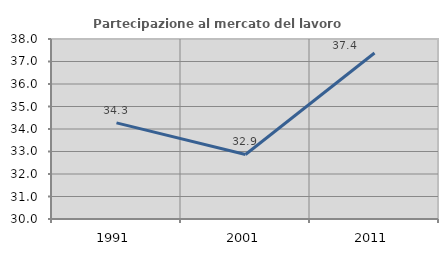
| Category | Partecipazione al mercato del lavoro  femminile |
|---|---|
| 1991.0 | 34.273 |
| 2001.0 | 32.868 |
| 2011.0 | 37.379 |